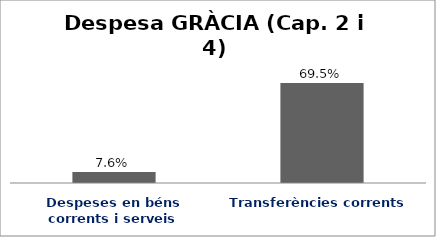
| Category | Series 0 |
|---|---|
| Despeses en béns corrents i serveis | 0.076 |
| Transferències corrents | 0.695 |